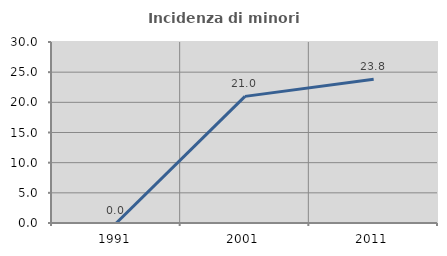
| Category | Incidenza di minori stranieri |
|---|---|
| 1991.0 | 0 |
| 2001.0 | 20.988 |
| 2011.0 | 23.834 |